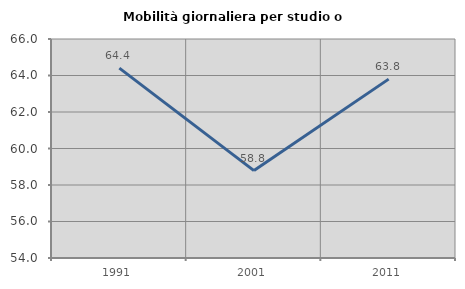
| Category | Mobilità giornaliera per studio o lavoro |
|---|---|
| 1991.0 | 64.402 |
| 2001.0 | 58.79 |
| 2011.0 | 63.801 |